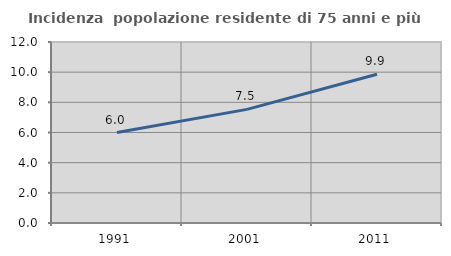
| Category | Incidenza  popolazione residente di 75 anni e più |
|---|---|
| 1991.0 | 5.996 |
| 2001.0 | 7.533 |
| 2011.0 | 9.867 |